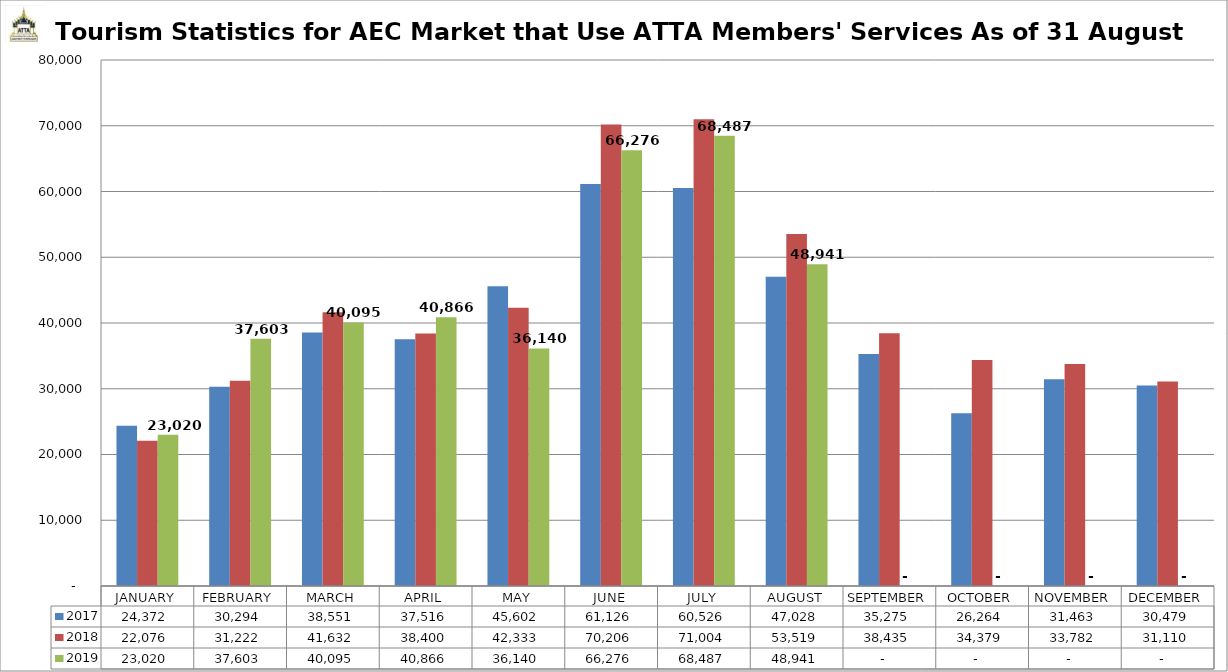
| Category | 2017 | 2018 | 2019 |
|---|---|---|---|
| JANUARY | 24372 | 22076 | 23020 |
| FEBRUARY | 30294 | 31222 | 37603 |
| MARCH | 38551 | 41632 | 40095 |
| APRIL | 37516 | 38400 | 40866 |
| MAY | 45602 | 42333 | 36140 |
| JUNE | 61126 | 70206 | 66276 |
| JULY | 60526 | 71004 | 68487 |
| AUGUST | 47028 | 53519 | 48941 |
| SEPTEMBER | 35275 | 38435 | 0 |
| OCTOBER | 26264 | 34379 | 0 |
| NOVEMBER | 31463 | 33782 | 0 |
| DECEMBER | 30479 | 31110 | 0 |